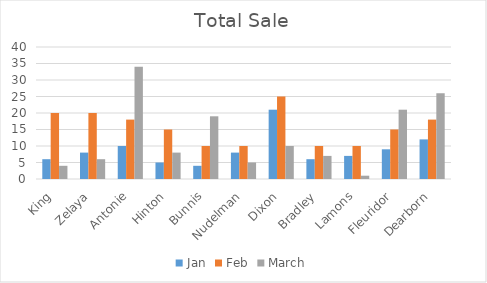
| Category | Jan | Feb | March |
|---|---|---|---|
| King | 6 | 20 | 4 |
| Zelaya | 8 | 20 | 6 |
| Antonie | 10 | 18 | 34 |
| Hinton | 5 | 15 | 8 |
| Bunnis | 4 | 10 | 19 |
| Nudelman | 8 | 10 | 5 |
| Dixon | 21 | 25 | 10 |
| Bradley | 6 | 10 | 7 |
| Lamons | 7 | 10 | 1 |
| Fleuridor | 9 | 15 | 21 |
| Dearborn | 12 | 18 | 26 |